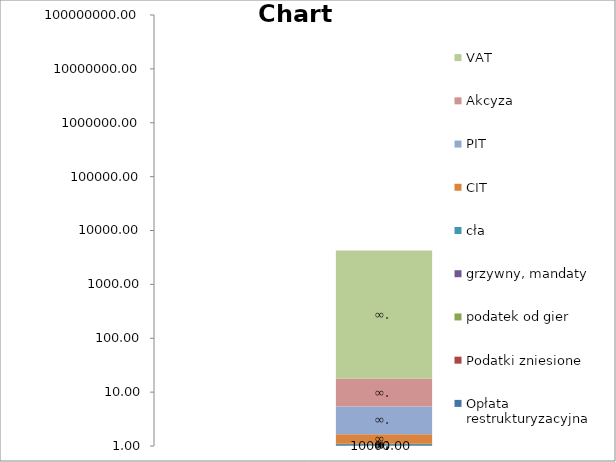
| Category | Opłata restrukturyzacyjna | Podatki zniesione | podatek od gier | grzywny, mandaty | cła | CIT | PIT | Akcyza | VAT |
|---|---|---|---|---|---|---|---|---|---|
| 0 | 4 | 12616 | 77869 | 120695 | 337343 | 2189965 | 6425768 | 6440759 | 29768025 |